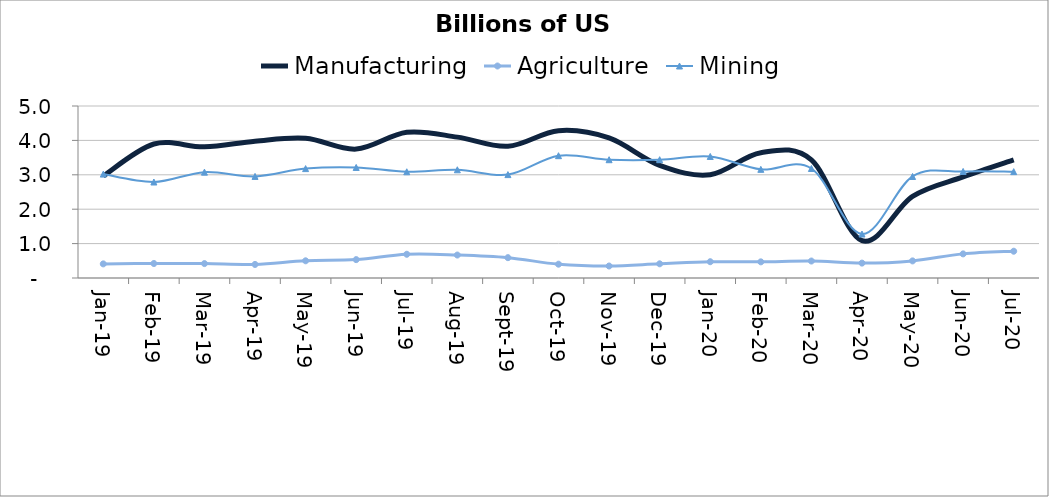
| Category | Manufacturing | Agriculture | Mining |
|---|---|---|---|
| 2019-01-31 | 2.965 | 0.41 | 3.02 |
| 2019-02-28 | 3.896 | 0.421 | 2.79 |
| 2019-03-31 | 3.812 | 0.419 | 3.077 |
| 2019-04-30 | 3.977 | 0.394 | 2.954 |
| 2019-05-31 | 4.061 | 0.5 | 3.18 |
| 2019-06-30 | 3.747 | 0.534 | 3.213 |
| 2019-07-31 | 4.236 | 0.69 | 3.088 |
| 2019-08-31 | 4.095 | 0.668 | 3.145 |
| 2019-09-30 | 3.829 | 0.591 | 3.006 |
| 2019-10-31 | 4.284 | 0.401 | 3.556 |
| 2019-11-30 | 4.071 | 0.349 | 3.439 |
| 2019-12-31 | 3.275 | 0.413 | 3.439 |
| 2020-01-31 | 3.001 | 0.473 | 3.533 |
| 2020-02-29 | 3.642 | 0.47 | 3.159 |
| 2020-03-31 | 3.431 | 0.493 | 3.184 |
| 2020-04-30 | 1.084 | 0.433 | 1.278 |
| 2020-05-31 | 2.374 | 0.497 | 2.951 |
| 2020-06-30 | 2.938 | 0.701 | 3.098 |
| 2020-07-31 | 3.433 | 0.778 | 3.092 |